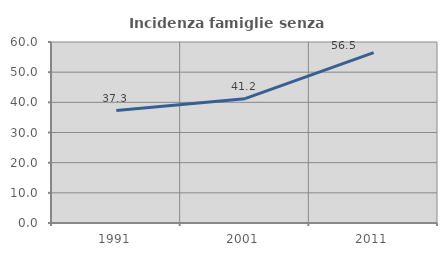
| Category | Incidenza famiglie senza nuclei |
|---|---|
| 1991.0 | 37.275 |
| 2001.0 | 41.216 |
| 2011.0 | 56.49 |